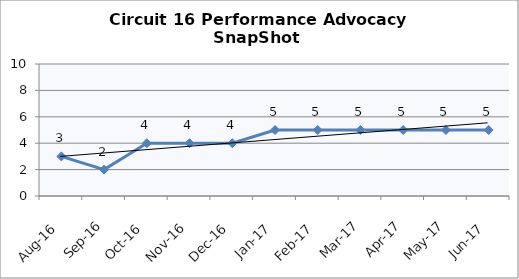
| Category | Circuit 16 |
|---|---|
| Aug-16 | 3 |
| Sep-16 | 2 |
| Oct-16 | 4 |
| Nov-16 | 4 |
| Dec-16 | 4 |
| Jan-17 | 5 |
| Feb-17 | 5 |
| Mar-17 | 5 |
| Apr-17 | 5 |
| May-17 | 5 |
| Jun-17 | 5 |